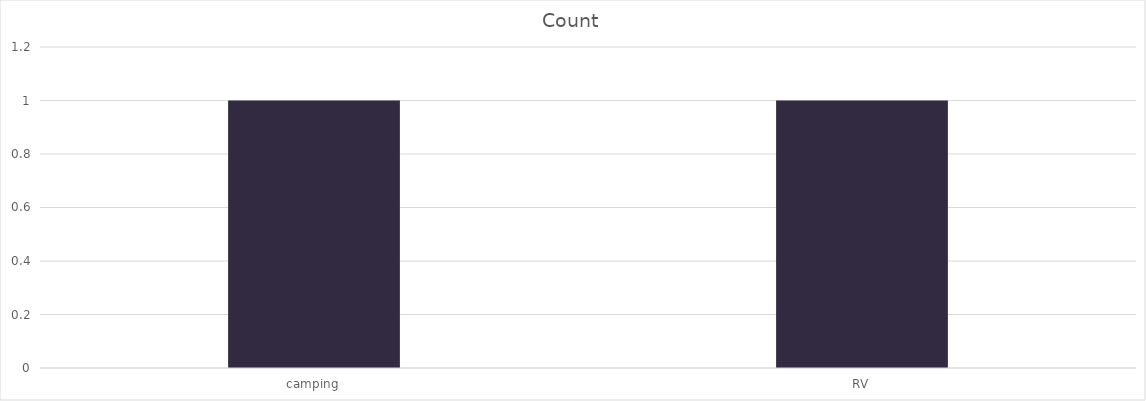
| Category | Count |
|---|---|
| camping | 1 |
| RV | 1 |